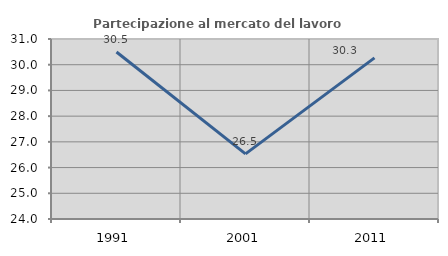
| Category | Partecipazione al mercato del lavoro  femminile |
|---|---|
| 1991.0 | 30.496 |
| 2001.0 | 26.534 |
| 2011.0 | 30.265 |